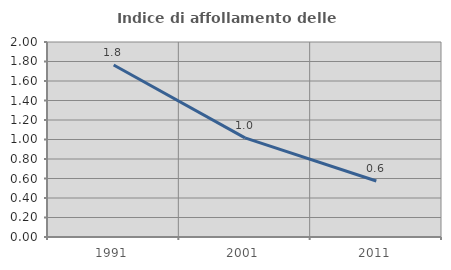
| Category | Indice di affollamento delle abitazioni  |
|---|---|
| 1991.0 | 1.765 |
| 2001.0 | 1.017 |
| 2011.0 | 0.574 |